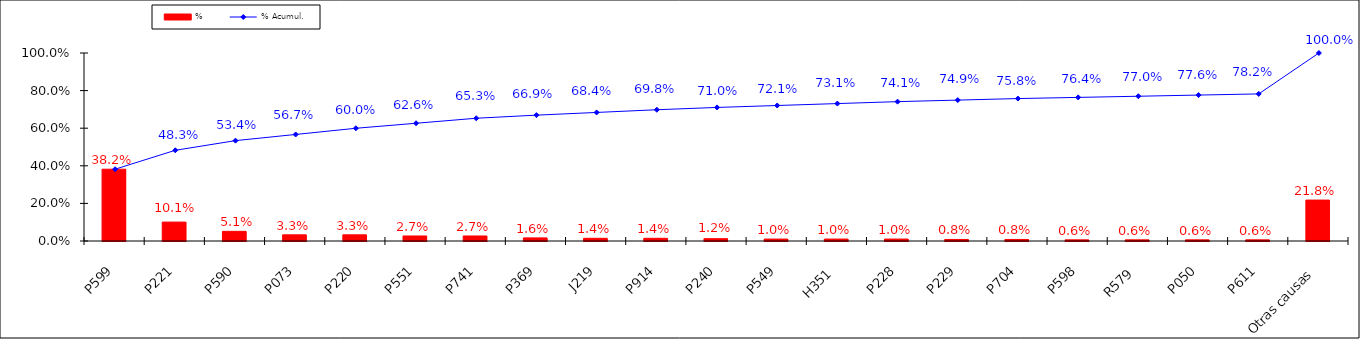
| Category | % |
|---|---|
| P599 | 0.382 |
| P221 | 0.101 |
| P590 | 0.051 |
| P073 | 0.033 |
| P220 | 0.033 |
| P551 | 0.027 |
| P741 | 0.027 |
| P369 | 0.016 |
| J219 | 0.014 |
| P914 | 0.014 |
| P240 | 0.012 |
| P549 | 0.01 |
| H351 | 0.01 |
| P228 | 0.01 |
| P229 | 0.008 |
| P704 | 0.008 |
| P598 | 0.006 |
| R579 | 0.006 |
| P050 | 0.006 |
| P611 | 0.006 |
| Otras causas | 0.218 |